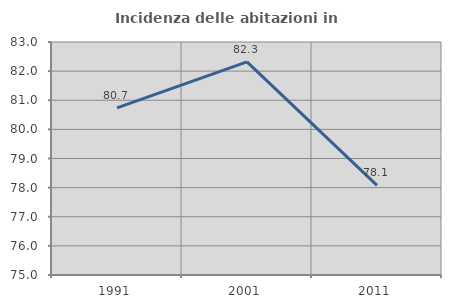
| Category | Incidenza delle abitazioni in proprietà  |
|---|---|
| 1991.0 | 80.737 |
| 2001.0 | 82.318 |
| 2011.0 | 78.076 |